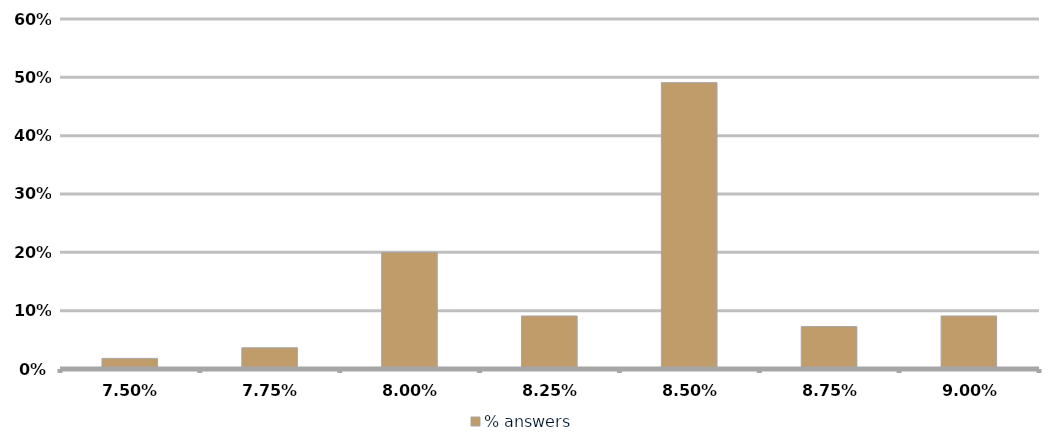
| Category | % answers |
|---|---|
| 0.075 | 0.018 |
| 0.0775 | 0.036 |
| 0.08 | 0.2 |
| 0.0825 | 0.091 |
| 0.085 | 0.491 |
| 0.08750000000000001 | 0.073 |
| 0.09000000000000001 | 0.091 |